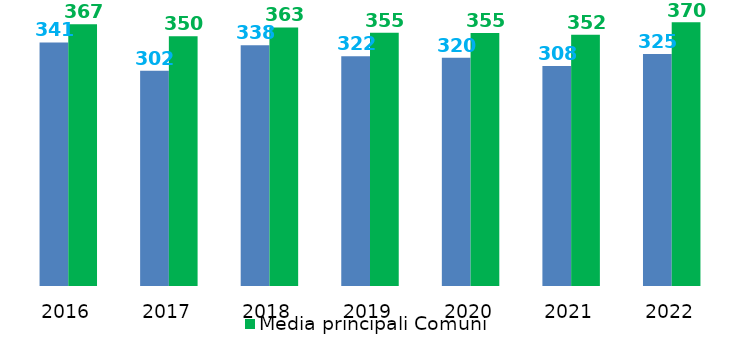
| Category | Spesa di personale procapite | Media principali Comuni |
|---|---|---|
| 2016.0 | 341.47 | 367.132 |
| 2017.0 | 301.67 | 350.148 |
| 2018.0 | 337.52 | 362.585 |
| 2019.0 | 322.059 | 355.014 |
| 2020.0 | 319.94 | 354.727 |
| 2021.0 | 308.42 | 352.252 |
| 2022.0 | 325.4 | 369.779 |